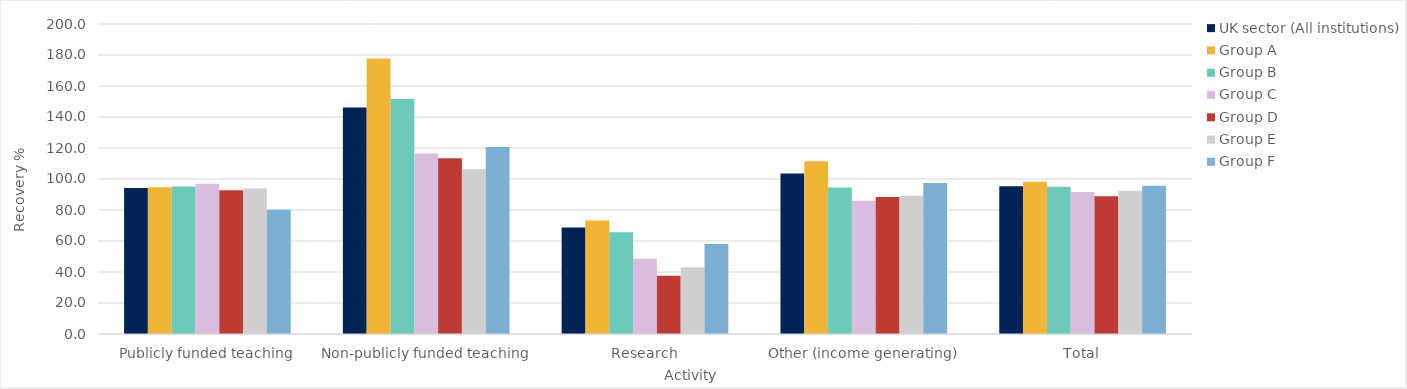
| Category | UK sector (All institutions) | Group A | Group B | Group C | Group D | Group E | Group F |
|---|---|---|---|---|---|---|---|
| 0 | 94.165 | 94.609 | 95.102 | 96.98 | 92.732 | 93.85 | 80.163 |
| 1 | 146.055 | 177.694 | 151.66 | 116.437 | 113.319 | 106.239 | 120.703 |
| 2 | 68.709 | 73.291 | 65.592 | 48.585 | 37.622 | 43.117 | 58.136 |
| 3 | 103.589 | 111.465 | 94.551 | 86.007 | 88.349 | 89.263 | 97.459 |
| 4 | 95.394 | 98.189 | 94.99 | 91.692 | 88.862 | 92.451 | 95.579 |